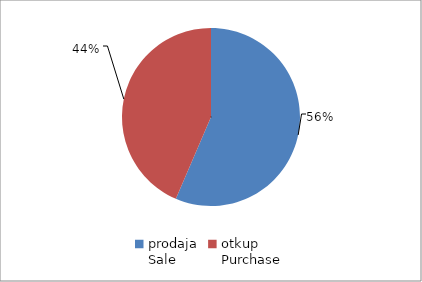
| Category | Series 0 |
|---|---|
| prodaja
Sale | 10811532 |
| otkup
Purchase | 8338378 |